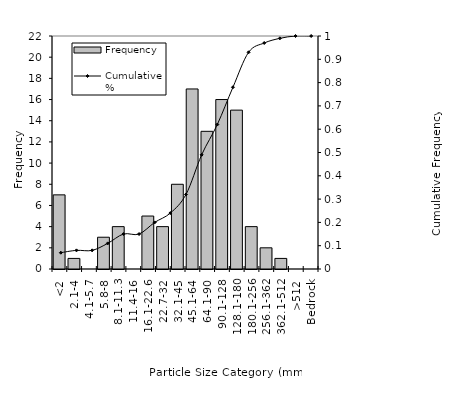
| Category | Frequency |
|---|---|
| <2 | 7 |
| 2.1-4 | 1 |
| 4.1-5.7 | 0 |
| 5.8-8 | 3 |
| 8.1-11.3 | 4 |
| 11.4-16 | 0 |
| 16.1-22.6 | 5 |
| 22.7-32 | 4 |
| 32.1-45 | 8 |
| 45.1-64 | 17 |
| 64.1-90 | 13 |
| 90.1-128 | 16 |
| 128.1-180 | 15 |
| 180.1-256 | 4 |
| 256.1-362 | 2 |
| 362.1-512 | 1 |
| >512 | 0 |
| Bedrock | 0 |